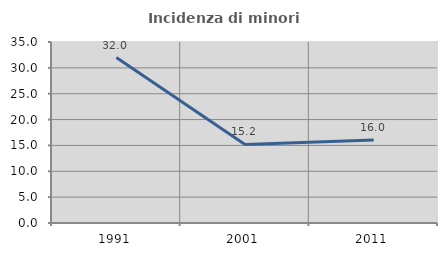
| Category | Incidenza di minori stranieri |
|---|---|
| 1991.0 | 32 |
| 2001.0 | 15.185 |
| 2011.0 | 16.028 |